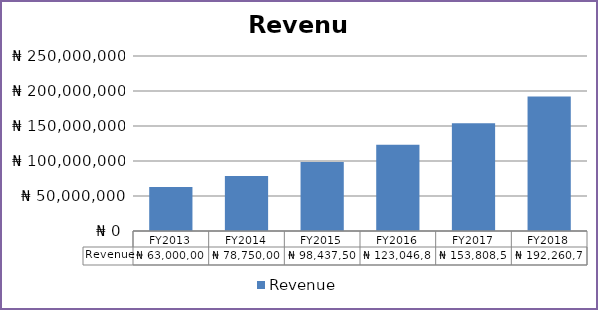
| Category | Revenue |
|---|---|
| FY2013 | 63000000 |
| FY2014 | 78750000 |
| FY2015 | 98437500 |
| FY2016 | 123046875 |
| FY2017 | 153808593.75 |
| FY2018 | 192260742.188 |